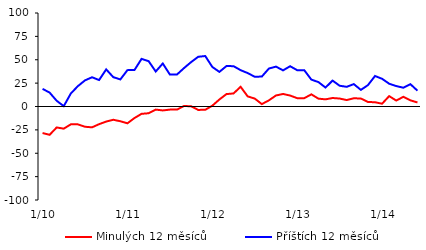
| Category | Minulých 12 měsíců | Příštích 12 měsíců |
|---|---|---|
|  1/10 | -28.38 | 18.87 |
|  2/10 | -30.28 | 14.86 |
|  3/10 | -22.41 | 6.12 |
|  4/10 | -23.71 | 0.35 |
|  5/10 | -19.08 | 13.92 |
|  6/10 | -19.11 | 21.81 |
|  7/10 | -21.66 | 27.94 |
|  8/10 | -22.29 | 31.28 |
|  9/10 | -18.88 | 28.29 |
|  10/10 | -16.12 | 39.67 |
|  11/10 | -14.18 | 31.39 |
|  12/10 | -15.78 | 28.96 |
|  1/11 | -17.96 | 38.89 |
|  2/11 | -12.33 | 39.05 |
|  3/11 | -7.84 | 50.96 |
|  4/11 | -7.2 | 48.47 |
|  5/11 | -3.3 | 37.42 |
|  6/11 | -4.21 | 45.99 |
|  7/11 | -3.33 | 34.17 |
|  8/11 | -3.33 | 34.17 |
|  9/11 | 0.51 | 41.09 |
|  10/11 | 0.28 | 47.47 |
|  11/11 | -3.65 | 53.17 |
|  12/11 | -3.52 | 53.99 |
|  1/12 | 0.85 | 42.3 |
|  2/12 | 7.49 | 37.02 |
|  3/12 | 13.29 | 43.26 |
|  4/12 | 13.96 | 43.14 |
|  5/12 | 21.08 | 38.87 |
|  6/12 | 10.81 | 35.74 |
|  7/12 | 8.46 | 31.81 |
|  8/12 | 2.55 | 32.03 |
|  9/12 | 6.58 | 40.6 |
|  10/12 | 11.79 | 42.65 |
|  11/12 | 13.41 | 38.66 |
|  12/12 | 11.71 | 43.07 |
|  1/13 | 8.92 | 38.82 |
|  2/13 | 8.92 | 38.82 |
|  3/13 | 12.98 | 28.75 |
|  4/13 | 8.4 | 26.12 |
|  5/13 | 7.64 | 20.26 |
|  6/13 | 9.1 | 27.71 |
|  7/13 | 8.51 | 22.2 |
|  8/13 | 6.89 | 21.06 |
|  9/13 | 8.81 | 23.95 |
|  10/13 | 8.54 | 17.76 |
|  11/13 | 4.88 | 22.87 |
|  12/13 | 4.53 | 32.62 |
|  1/14 | 2.99 | 29.64 |
|  2/14 | 11.1 | 24.37 |
|  3/14 | 6.35 | 21.86 |
|  4/14 | 10.34 | 20.09 |
|  5/14 | 6.57 | 23.91 |
|  6/14 | 4.33 | 16.91 |